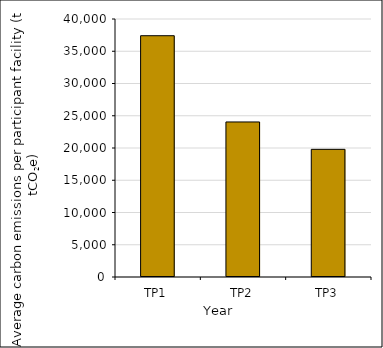
| Category | Average emissions per facility (tCO2e) |
|---|---|
| TP1 | 37410.226 |
| TP2 | 24037.57 |
| TP3 | 19791.898 |